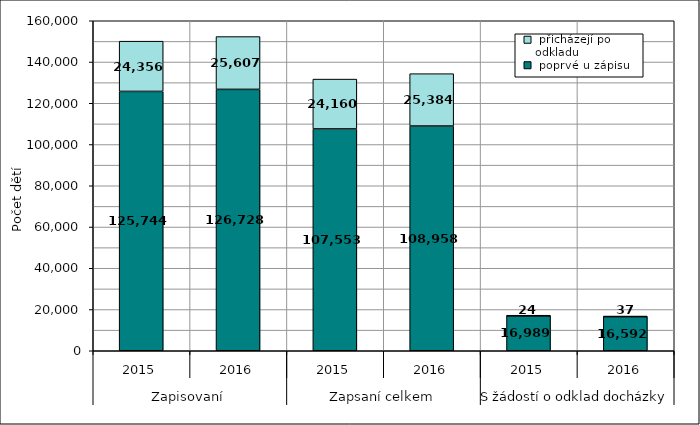
| Category |  poprvé u zápisu |  přicházejí po odkladu |
|---|---|---|
| 0 | 125744 | 24356 |
| 1 | 126728 | 25607 |
| 2 | 107553 | 24160 |
| 3 | 108958 | 25384 |
| 4 | 16989 | 24 |
| 5 | 16592 | 37 |